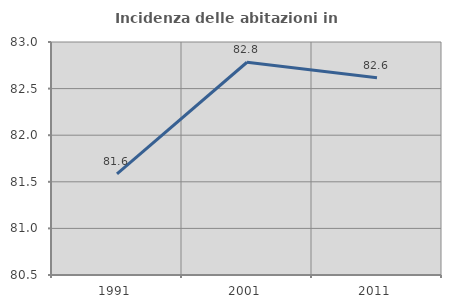
| Category | Incidenza delle abitazioni in proprietà  |
|---|---|
| 1991.0 | 81.584 |
| 2001.0 | 82.783 |
| 2011.0 | 82.615 |